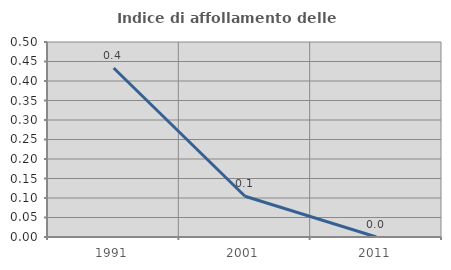
| Category | Indice di affollamento delle abitazioni  |
|---|---|
| 1991.0 | 0.433 |
| 2001.0 | 0.104 |
| 2011.0 | 0 |